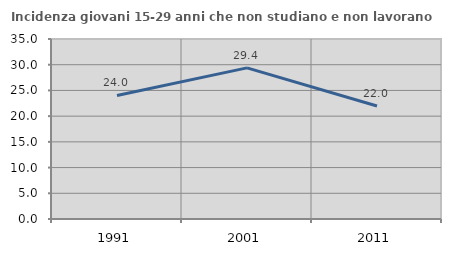
| Category | Incidenza giovani 15-29 anni che non studiano e non lavorano  |
|---|---|
| 1991.0 | 24.031 |
| 2001.0 | 29.391 |
| 2011.0 | 21.97 |